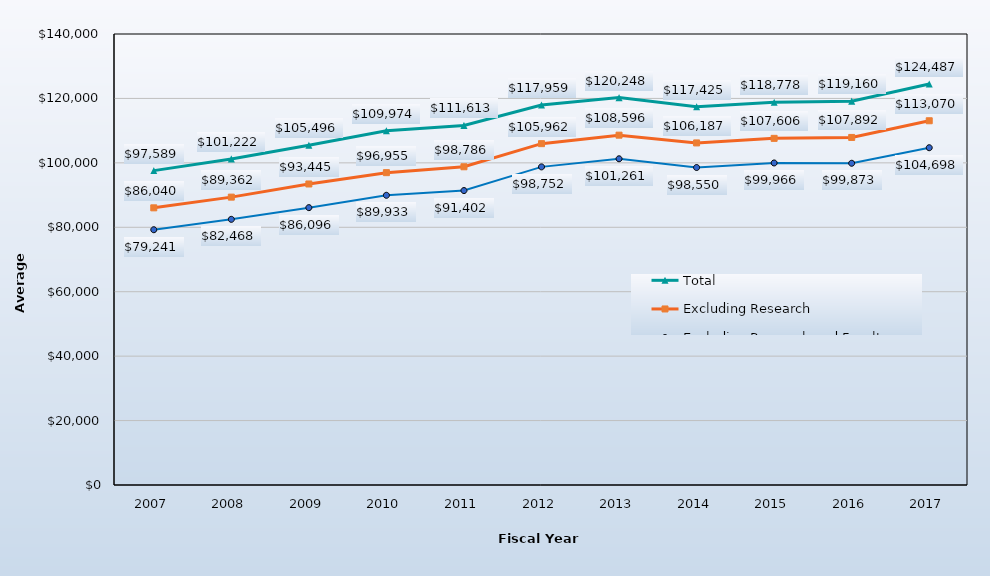
| Category | Total | Excluding Research | Excluding Research and Faculty Practice |
|---|---|---|---|
| 2007.0 | 97589 | 86040 | 79241 |
| 2008.0 | 101222 | 89362 | 82468 |
| 2009.0 | 105496 | 93445 | 86096 |
| 2010.0 | 109974 | 96955 | 89933 |
| 2011.0 | 111613 | 98786 | 91402 |
| 2012.0 | 117959 | 105962 | 98752 |
| 2013.0 | 120248 | 108596 | 101261 |
| 2014.0 | 117425 | 106187 | 98550 |
| 2015.0 | 118778 | 107606 | 99966 |
| 2016.0 | 119160 | 107892 | 99873 |
| 2017.0 | 124487 | 113070 | 104698 |